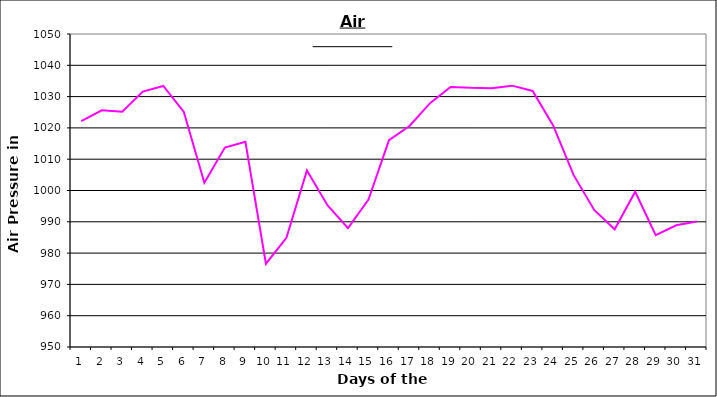
| Category | Series 0 |
|---|---|
| 0 | 1022.2 |
| 1 | 1025.6 |
| 2 | 1025.2 |
| 3 | 1031.6 |
| 4 | 1033.4 |
| 5 | 1025.1 |
| 6 | 1002.5 |
| 7 | 1013.7 |
| 8 | 1015.6 |
| 9 | 976.6 |
| 10 | 984.9 |
| 11 | 1006.4 |
| 12 | 995.3 |
| 13 | 988 |
| 14 | 997.1 |
| 15 | 1016.1 |
| 16 | 1020.6 |
| 17 | 1027.9 |
| 18 | 1033.1 |
| 19 | 1032.8 |
| 20 | 1032.7 |
| 21 | 1033.5 |
| 22 | 1031.8 |
| 23 | 1020.8 |
| 24 | 1004.9 |
| 25 | 993.8 |
| 26 | 987.6 |
| 27 | 999.6 |
| 28 | 985.7 |
| 29 | 988.9 |
| 30 | 990.1 |